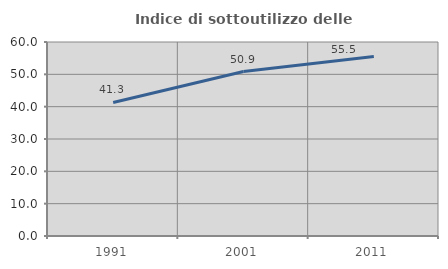
| Category | Indice di sottoutilizzo delle abitazioni  |
|---|---|
| 1991.0 | 41.292 |
| 2001.0 | 50.865 |
| 2011.0 | 55.516 |